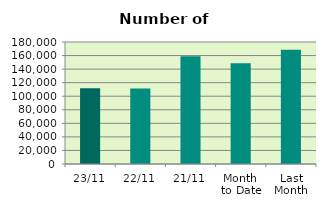
| Category | Series 0 |
|---|---|
| 23/11 | 111870 |
| 22/11 | 111400 |
| 21/11 | 158984 |
| Month 
to Date | 148535.882 |
| Last
Month | 168717.043 |